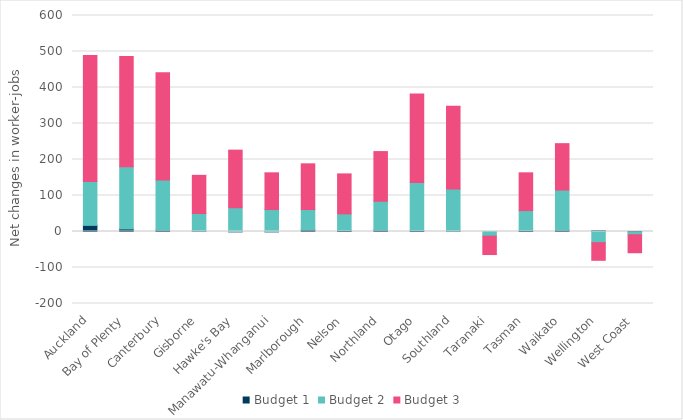
| Category | Budget 1 | Budget 2 | Budget 3 |
|---|---|---|---|
| Auckland | 17 | 122 | 350 |
| Bay of Plenty | 7 | 173 | 306 |
| Canterbury | 4 | 139 | 298 |
| Gisborne | 1 | 49 | 106 |
| Hawke's Bay | -1 | 66 | 160 |
| Manawatu-Whanganui | -1 | 61 | 102 |
| Marlborough | 5 | 56 | 127 |
| Nelson | 3 | 46 | 111 |
| Northland | 4 | 80 | 138 |
| Otago | 3 | 133 | 246 |
| Southland | 1 | 117 | 230 |
| Taranaki | 0 | -13 | -51 |
| Tasman | 3 | 55 | 105 |
| Waikato | 4 | 111 | 129 |
| Wellington | 2 | -31 | -49 |
| West Coast | -2 | -7 | -50 |